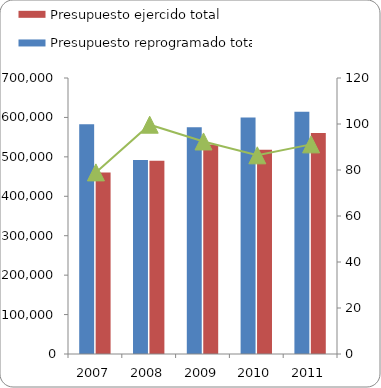
| Category | Presupuesto reprogramado total | Presupuesto ejercido total |
|---|---|---|
| 2007 | 582817 | 460217 |
| 2008 | 491777 | 490288 |
| 2009 | 575170 | 531486 |
| 2010 | 599924 | 518241 |
| 2011 | 614651 | 560225 |